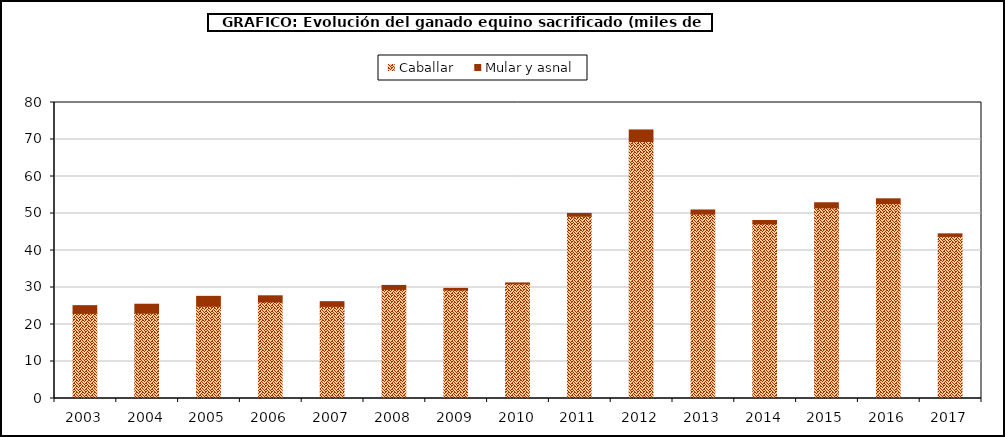
| Category | Caballar | Mular y asnal |
|---|---|---|
| 2003.0 | 23.011 | 2.082 |
| 2004.0 | 23.066 | 2.415 |
| 2005.0 | 24.929 | 2.681 |
| 2006.0 | 26.083 | 1.673 |
| 2007.0 | 24.904 | 1.267 |
| 2008.0 | 29.488 | 1.075 |
| 2009.0 | 29.317 | 0.44 |
| 2010.0 | 30.985 | 0.252 |
| 2011.0 | 49.28 | 0.744 |
| 2012.0 | 69.446 | 3.136 |
| 2013.0 | 49.841 | 1.113 |
| 2014.0 | 47.193 | 0.922 |
| 2015.0 | 51.517 | 1.391 |
| 2016.0 | 52.671 | 1.297 |
| 2017.0 | 43.813 | 0.688 |